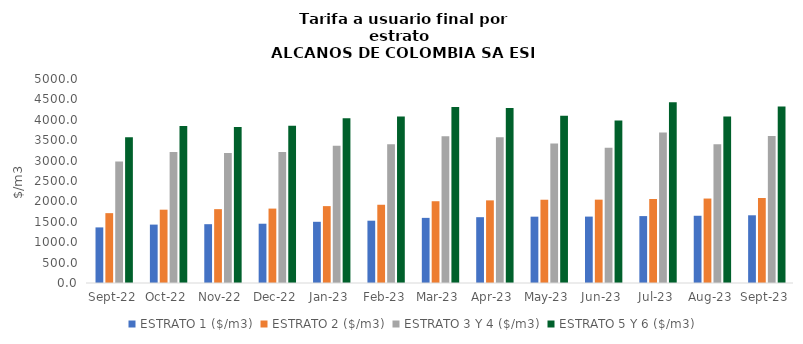
| Category | ESTRATO 1 ($/m3) | ESTRATO 2 ($/m3) | ESTRATO 3 Y 4 ($/m3) | ESTRATO 5 Y 6 ($/m3) |
|---|---|---|---|---|
| 2022-09-01 | 1362.74 | 1711.93 | 2979.32 | 3575.184 |
| 2022-10-01 | 1431.37 | 1796.98 | 3208.12 | 3849.744 |
| 2022-11-01 | 1441.49 | 1809.92 | 3185.9 | 3823.08 |
| 2022-12-01 | 1452.83 | 1823.71 | 3209.93 | 3851.916 |
| 2023-01-01 | 1500.18 | 1884.37 | 3365.49 | 4038.588 |
| 2023-02-01 | 1526.99 | 1917.75 | 3398.26 | 4077.912 |
| 2023-03-01 | 1596.45 | 2004.11 | 3596.1 | 4315.32 |
| 2023-04-01 | 1613.02 | 2025.28 | 3575.22 | 4290.264 |
| 2023-05-01 | 1625.74 | 2040.95 | 3416.65 | 4099.98 |
| 2023-06-01 | 1627.48 | 2042.98 | 3316.57 | 3979.884 |
| 2023-07-01 | 1639.99 | 2059.51 | 3689.81 | 4427.772 |
| 2023-08-01 | 1648.05 | 2069.91 | 3401.48 | 4081.776 |
| 2023-09-01 | 1659.68 | 2084.34 | 3603.59 | 4324.308 |